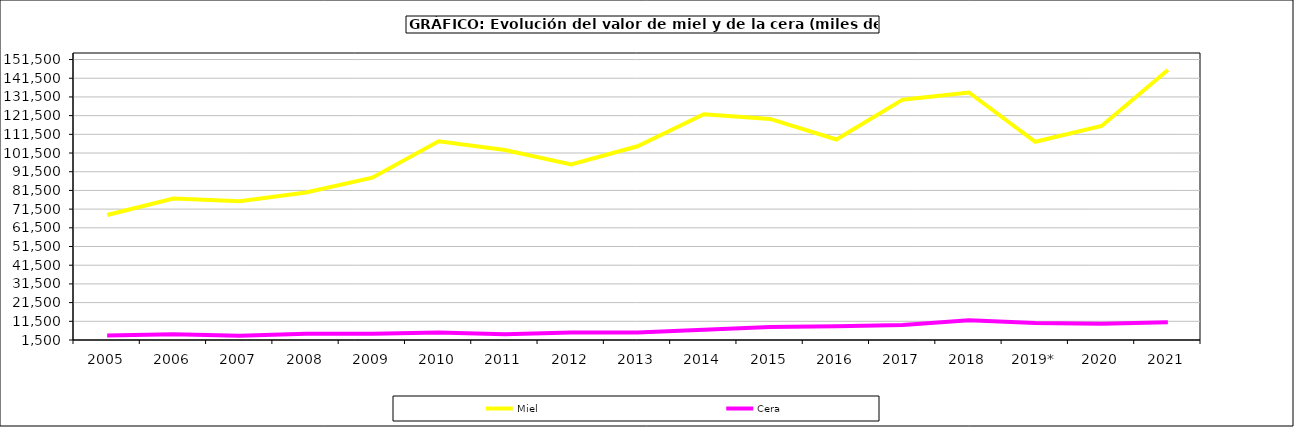
| Category | Miel | Cera |
|---|---|---|
| 2005 | 68333.193 | 3903.341 |
| 2006 | 77210.535 | 4545.79 |
| 2007 | 75671.047 | 3782.043 |
| 2008 | 80408.918 | 4776.982 |
| 2009 | 88291.438 | 4877.522 |
| 2010 | 107827.095 | 5514.256 |
| 2011 | 103137.845 | 4533.385 |
| 2012 | 95366.296 | 5543.637 |
| 2013 | 105102.791 | 5553.321 |
| 2014 | 122217.175 | 7026.714 |
| 2015 | 119753.033 | 8392.273 |
| 2016 | 108750.281 | 8900.258 |
| 2017 | 130055.688 | 9514.815 |
| 2018 | 133889.869 | 12109.137 |
| 2019* | 107532.699 | 10532.872 |
| 2020 | 115975.21 | 10235.426 |
| 2021 | 145865.346 | 11002.183 |